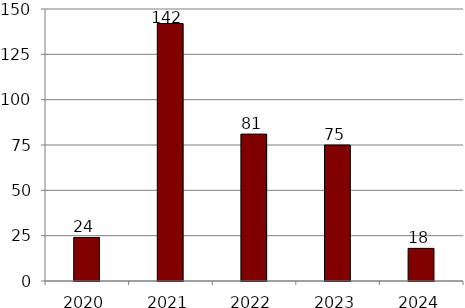
| Category | Series 1 |
|---|---|
| 2020.0 | 24 |
| 2021.0 | 142 |
| 2022.0 | 81 |
| 2023.0 | 75 |
| 2024.0 | 18 |